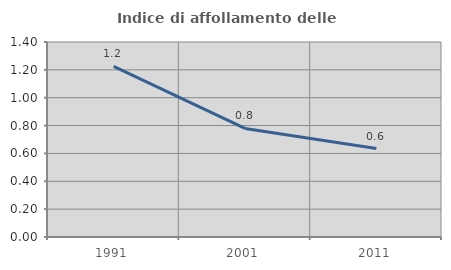
| Category | Indice di affollamento delle abitazioni  |
|---|---|
| 1991.0 | 1.225 |
| 2001.0 | 0.78 |
| 2011.0 | 0.635 |